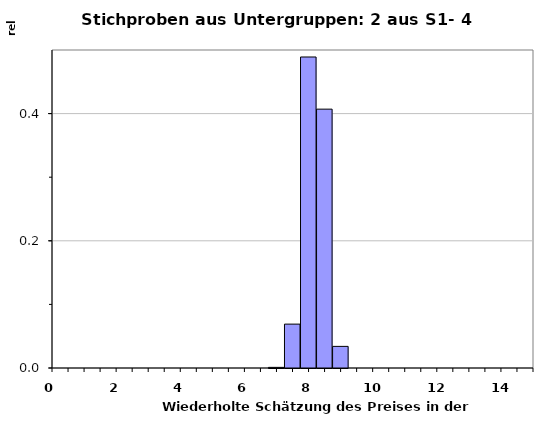
| Category | Methode 2 |
|---|---|
| 0.0 | 0 |
| 0.5 | 0 |
| 1.0 | 0 |
| 1.5 | 0 |
| 2.0 | 0 |
| 2.5 | 0 |
| 3.0 | 0 |
| 3.5 | 0 |
| 4.0 | 0 |
| 4.5 | 0 |
| 5.0 | 0 |
| 5.5 | 0 |
| 6.0 | 0 |
| 6.5 | 0 |
| 7.0 | 0.001 |
| 7.5 | 0.069 |
| 8.0 | 0.489 |
| 8.5 | 0.407 |
| 9.0 | 0.034 |
| 9.5 | 0 |
| 10.0 | 0 |
| 10.5 | 0 |
| 11.0 | 0 |
| 11.5 | 0 |
| 12.0 | 0 |
| 12.5 | 0 |
| 13.0 | 0 |
| 13.5 | 0 |
| 14.0 | 0 |
| 14.5 | 0 |
| 15.0 | 0 |